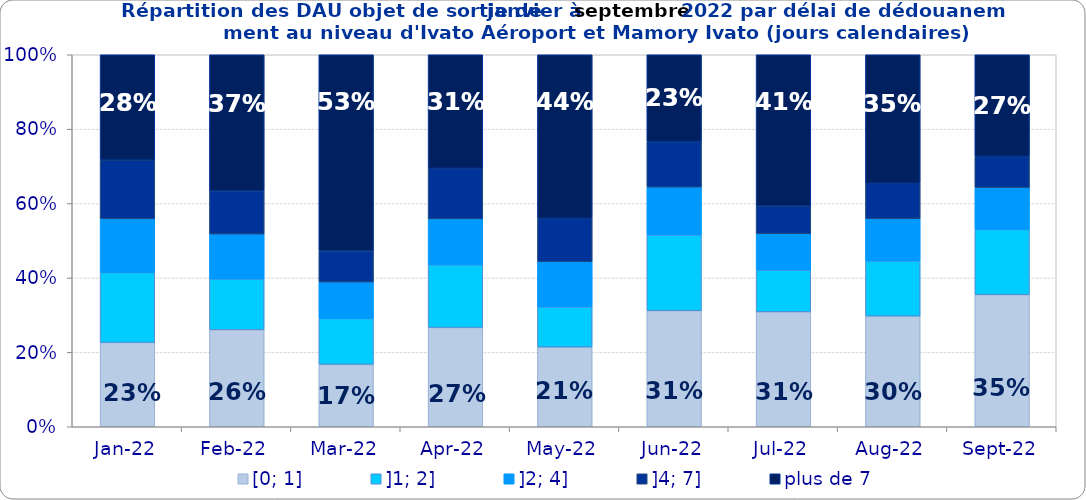
| Category | [0; 1] | ]1; 2] | ]2; 4] | ]4; 7] | plus de 7 |
|---|---|---|---|---|---|
| 2022-01-01 | 0.227 | 0.188 | 0.145 | 0.158 | 0.283 |
| 2022-02-01 | 0.261 | 0.136 | 0.121 | 0.116 | 0.366 |
| 2022-03-01 | 0.168 | 0.123 | 0.098 | 0.083 | 0.527 |
| 2022-04-01 | 0.267 | 0.169 | 0.123 | 0.136 | 0.305 |
| 2022-05-01 | 0.214 | 0.108 | 0.122 | 0.116 | 0.44 |
| 2022-06-01 | 0.312 | 0.203 | 0.129 | 0.122 | 0.233 |
| 2022-07-01 | 0.309 | 0.112 | 0.098 | 0.074 | 0.407 |
| 2022-08-01 | 0.298 | 0.148 | 0.114 | 0.095 | 0.345 |
| 2022-09-01 | 0.355 | 0.175 | 0.112 | 0.084 | 0.273 |